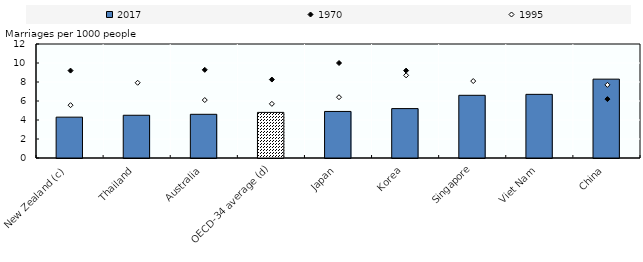
| Category | 2017 |
|---|---|
| New Zealand (c) | 4.3 |
| Thailand | 4.5 |
| Australia | 4.6 |
| OECD-34 average (d) | 4.8 |
| Japan | 4.9 |
| Korea | 5.2 |
| Singapore | 6.6 |
| Viet Nam | 6.7 |
| China | 8.3 |